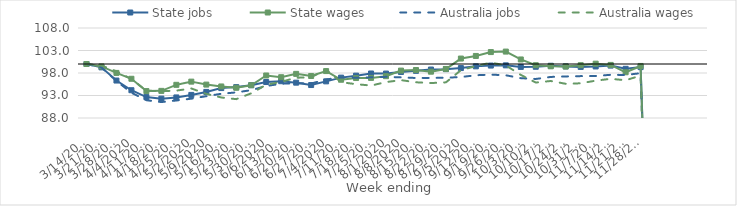
| Category | State jobs | State wages | Australia jobs | Australia wages |
|---|---|---|---|---|
| 14/03/2020 | 100 | 100 | 100 | 100 |
| 21/03/2020 | 99.254 | 99.464 | 99.244 | 99.654 |
| 28/03/2020 | 96.324 | 98.018 | 96.24 | 98.376 |
| 04/04/2020 | 94.174 | 96.716 | 93.611 | 96.647 |
| 11/04/2020 | 92.648 | 93.98 | 91.951 | 94.065 |
| 18/04/2020 | 92.303 | 94.028 | 91.54 | 93.96 |
| 25/04/2020 | 92.572 | 95.372 | 91.89 | 94.086 |
| 02/05/2020 | 93.129 | 96.083 | 92.294 | 94.563 |
| 09/05/2020 | 93.797 | 95.422 | 92.851 | 93.362 |
| 16/05/2020 | 94.647 | 95.008 | 93.38 | 92.559 |
| 23/05/2020 | 94.865 | 94.72 | 93.691 | 92.191 |
| 30/05/2020 | 95.292 | 95.286 | 94.189 | 93.489 |
| 06/06/2020 | 95.995 | 97.445 | 95.112 | 95.384 |
| 13/06/2020 | 96.175 | 97.063 | 95.61 | 96.041 |
| 20/06/2020 | 95.854 | 97.806 | 95.758 | 96.951 |
| 27/06/2020 | 95.324 | 97.338 | 95.662 | 97.048 |
| 04/07/2020 | 96.14 | 98.426 | 96.562 | 98.782 |
| 11/07/2020 | 96.971 | 96.501 | 97.02 | 95.951 |
| 18/07/2020 | 97.412 | 96.88 | 96.939 | 95.522 |
| 25/07/2020 | 97.891 | 96.911 | 97.042 | 95.21 |
| 01/08/2020 | 97.873 | 97.294 | 97.145 | 95.98 |
| 08/08/2020 | 98.233 | 98.535 | 97.028 | 96.418 |
| 15/08/2020 | 98.484 | 98.66 | 96.891 | 95.936 |
| 22/08/2020 | 98.768 | 98.294 | 96.912 | 95.768 |
| 29/08/2020 | 98.855 | 98.899 | 96.951 | 95.924 |
| 05/09/2020 | 99.094 | 101.21 | 97.102 | 98.618 |
| 12/09/2020 | 99.481 | 101.79 | 97.5 | 99.542 |
| 19/09/2020 | 99.651 | 102.65 | 97.636 | 100.304 |
| 26/09/2020 | 99.699 | 102.76 | 97.498 | 99.685 |
| 03/10/2020 | 99.352 | 101.009 | 96.847 | 97.575 |
| 10/10/2020 | 99.389 | 99.729 | 96.677 | 95.876 |
| 17/10/2020 | 99.611 | 99.488 | 97.124 | 96.224 |
| 24/10/2020 | 99.472 | 99.433 | 97.241 | 95.599 |
| 31/10/2020 | 99.352 | 99.736 | 97.306 | 95.715 |
| 07/11/2020 | 99.452 | 100.07 | 97.335 | 96.299 |
| 14/11/2020 | 99.645 | 99.796 | 97.6 | 96.705 |
| 21/11/2020 | 98.927 | 98.16 | 97.567 | 96.396 |
| 28/11/2020 | 99.307 | 99.566 | 97.955 | 97.416 |